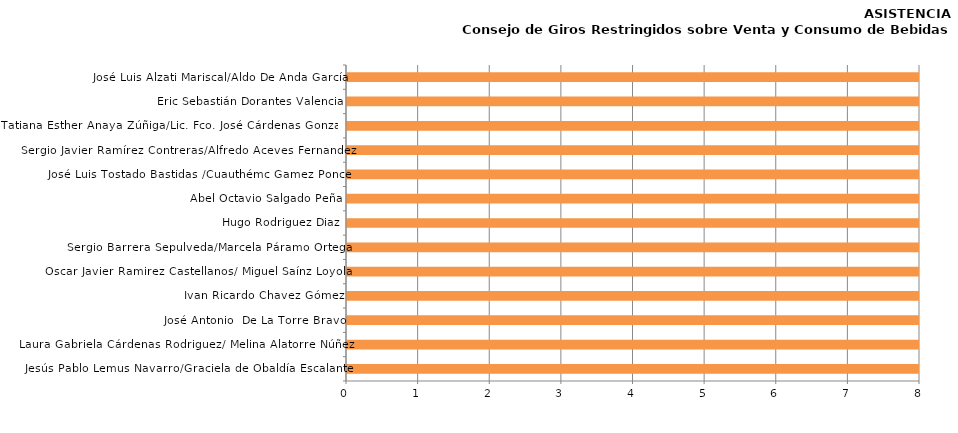
| Category | Series 0 |
|---|---|
| Jesús Pablo Lemus Navarro/Graciela de Obaldía Escalante | 13 |
| Laura Gabriela Cárdenas Rodriguez/ Melina Alatorre Núñez | 13 |
| José Antonio  De La Torre Bravo | 11 |
| Ivan Ricardo Chavez Gómez | 12 |
| Oscar Javier Ramirez Castellanos/ Miguel Saínz Loyola | 11 |
| Sergio Barrera Sepulveda/Marcela Páramo Ortega | 12 |
| Hugo Rodriguez Diaz | 11 |
| Abel Octavio Salgado Peña | 12 |
| José Luis Tostado Bastidas /Cuauthémc Gamez Ponce | 10 |
| Sergio Javier Ramírez Contreras/Alfredo Aceves Fernandez | 13 |
| Tatiana Esther Anaya Zúñiga/Lic. Fco. José Cárdenas Gonzalez | 12 |
| Eric Sebastián Dorantes Valencia | 9 |
| José Luis Alzati Mariscal/Aldo De Anda García | 10 |